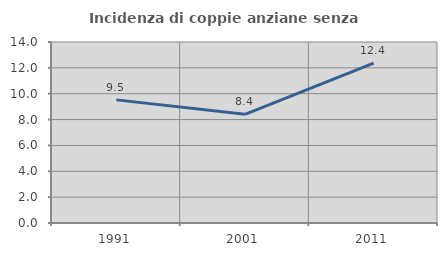
| Category | Incidenza di coppie anziane senza figli  |
|---|---|
| 1991.0 | 9.524 |
| 2001.0 | 8.403 |
| 2011.0 | 12.371 |